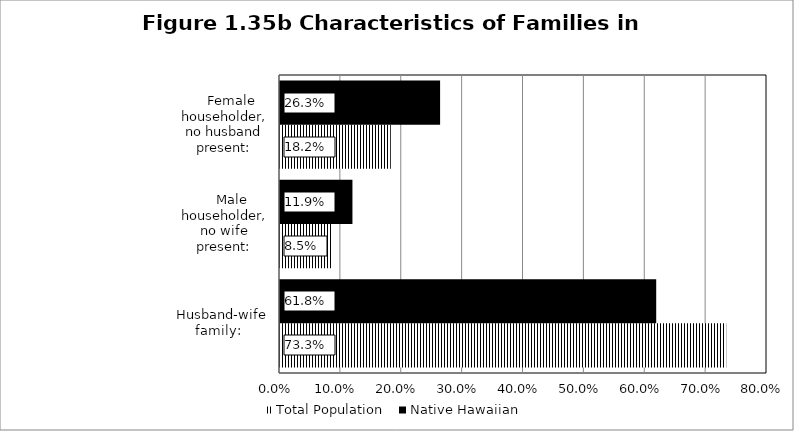
| Category | Total Population | Native Hawaiian |
|---|---|---|
|   Husband-wife family: | 0.733 | 0.618 |
|     Male householder, no wife present: | 0.085 | 0.119 |
|     Female householder, no husband present: | 0.182 | 0.263 |